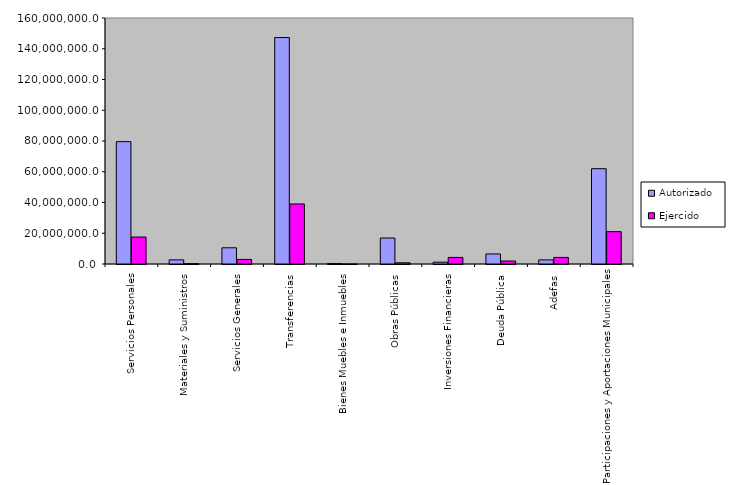
| Category | Autorizado | Ejercido |
|---|---|---|
| 0 | 79564015.3 | 17524780.2 |
| 1 | 2691917.2 | 214821.2 |
| 2 | 10544106.1 | 2980996.3 |
| 3 | 147294731.4 | 39040321.3 |
| 4 | 261934.1 | 32.2 |
| 5 | 16883038.4 | 789457.1 |
| 6 | 1183634.9 | 4276179.6 |
| 7 | 6532825.3 | 1927100.1 |
| 8 | 2671236.6 | 4273568.6 |
| 9 | 61974507.1 | 21040172.3 |